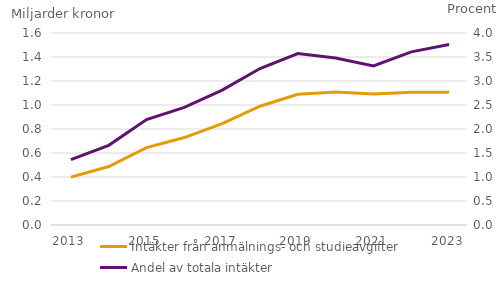
| Category | Intäkter från anmälnings- och studieavgifter |
|---|---|
| 2013 | 0.399 |
| 2014 | 0.487 |
| 2015 | 0.645 |
| 2016 | 0.729 |
| 2017 | 0.845 |
| 2018 | 0.99 |
| 2019 | 1.09 |
| 2020 | 1.108 |
| 2021 | 1.092 |
| 2022 | 1.107 |
| 2023 | 1.106 |